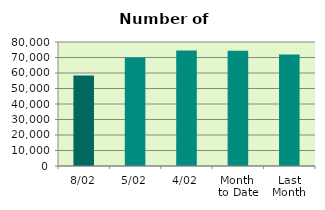
| Category | Series 0 |
|---|---|
| 8/02 | 58308 |
| 5/02 | 69996 |
| 4/02 | 74506 |
| Month 
to Date | 74334.667 |
| Last
Month | 71883.3 |